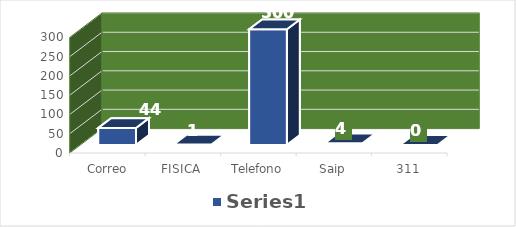
| Category | Series 0 |
|---|---|
| Correo elect. | 44 |
| FISICA | 1 |
| Telefono | 300 |
| Saip | 4 |
| 311 | 0 |